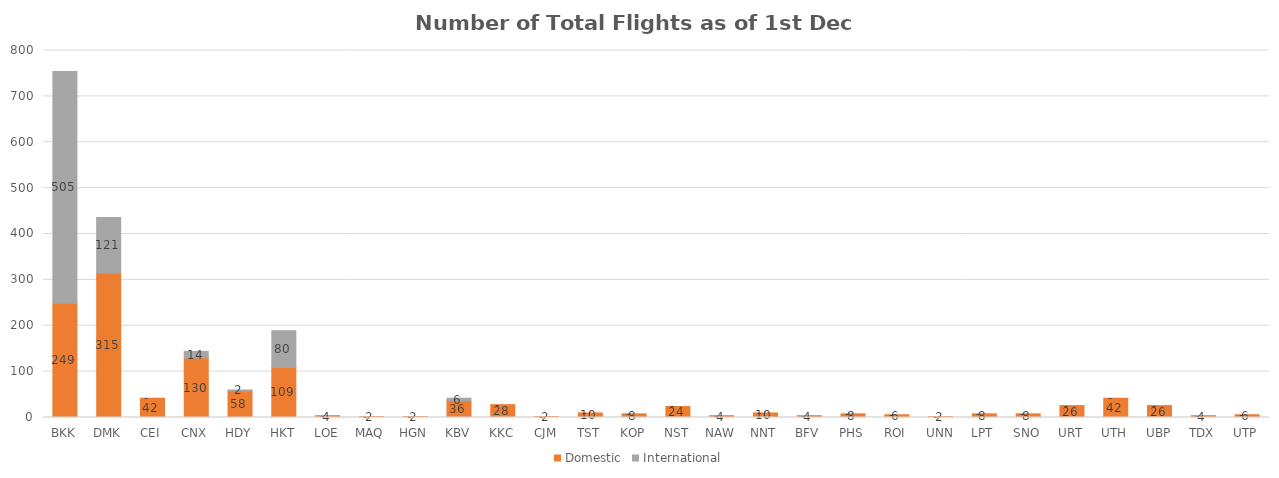
| Category | Domestic | International |
|---|---|---|
| BKK | 249 | 505 |
| DMK | 315 | 121 |
| CEI | 42 | 0 |
| CNX | 130 | 14 |
| HDY | 58 | 2 |
| HKT | 109 | 80 |
| LOE | 4 | 0 |
| MAQ | 2 | 0 |
| HGN | 2 | 0 |
| KBV | 36 | 6 |
| KKC | 28 | 0 |
| CJM | 2 | 0 |
| TST | 10 | 0 |
| KOP | 8 | 0 |
| NST | 24 | 0 |
| NAW | 4 | 0 |
| NNT | 10 | 0 |
| BFV | 4 | 0 |
| PHS | 8 | 0 |
| ROI | 6 | 0 |
| UNN | 2 | 0 |
| LPT | 8 | 0 |
| SNO | 8 | 0 |
| URT | 26 | 0 |
| UTH | 42 | 0 |
| UBP | 26 | 0 |
| TDX | 4 | 0 |
| UTP | 6 | 0 |